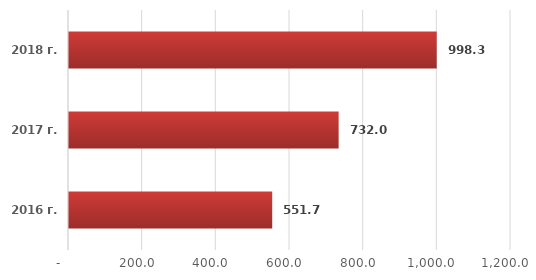
| Category | Series 0 |
|---|---|
| 2016 г. | 551.7 |
| 2017 г. | 732.017 |
| 2018 г. | 998.3 |